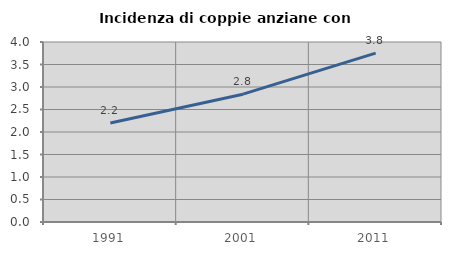
| Category | Incidenza di coppie anziane con figli |
|---|---|
| 1991.0 | 2.199 |
| 2001.0 | 2.841 |
| 2011.0 | 3.754 |